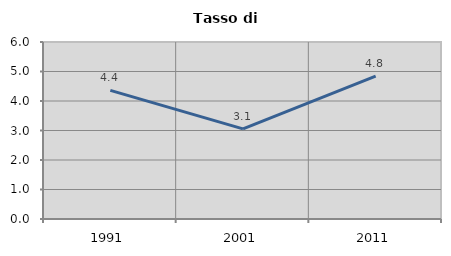
| Category | Tasso di disoccupazione   |
|---|---|
| 1991.0 | 4.361 |
| 2001.0 | 3.053 |
| 2011.0 | 4.844 |